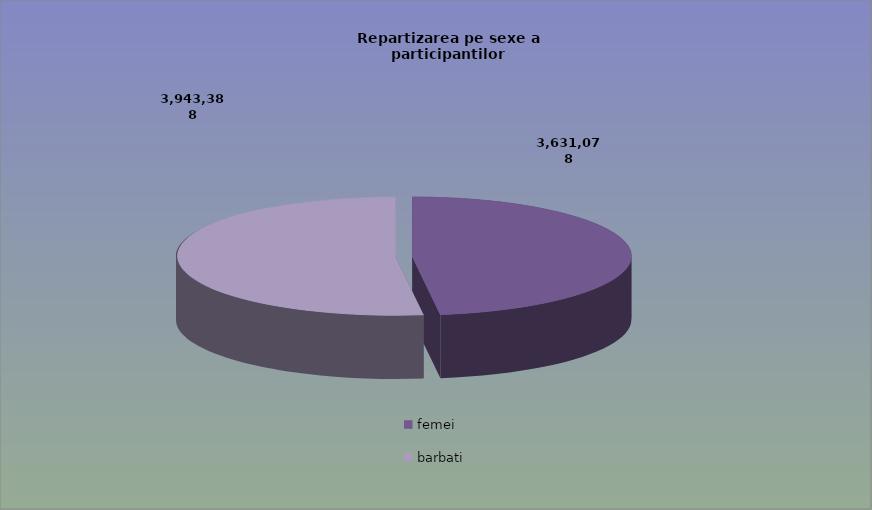
| Category | Series 0 |
|---|---|
| femei | 3631078 |
| barbati | 3943388 |